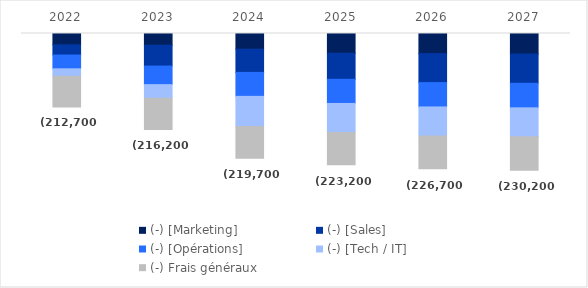
| Category | (-) [Marketing] | (-) [Sales] | (-) [Opérations] | (-) [Tech / IT] | (-) Frais généraux | Series 5 |
|---|---|---|---|---|---|---|
| 2022.0 | -78000 | -70500 | -94950 | -51000 | -212700 | -212700 |
| 2023.0 | -80800 | -143600 | -128300 | -93600 | -216200 | -216200 |
| 2024.0 | -108450 | -159900 | -165200 | -207200 | -219700 | -219700 |
| 2025.0 | -136100 | -179750 | -166600 | -200100 | -223200 | -223200 |
| 2026.0 | -138900 | -199600 | -168000 | -200100 | -226700 | -226700 |
| 2027.0 | -141700 | -201700 | -169400 | -200100 | -230200 | -230200 |